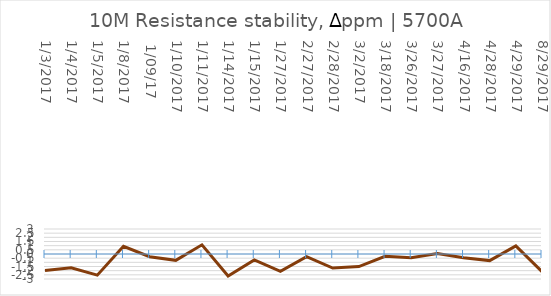
| Category | Series 0 |
|---|---|
| 1/3/2017 | -1.97 |
| 1/4/2017 | -1.65 |
| 1/5/2017 | -2.54 |
| 1/8/2017 | 0.93 |
|  1/09/17 | -0.33 |
| 1/10/2017 | -0.76 |
| 1/11/2017 | 1.1 |
| 1/14/2017 | -2.65 |
| 1/15/2017 | -0.72 |
| 1/27/2017 | -2.09 |
| 2/27/2017 | -0.32 |
| 2/28/2017 | -1.69 |
| 3/2/2017 | -1.51 |
| 3/18/2017 | -0.28 |
| 3/26/2017 | -0.45 |
| 3/27/2017 | 0.06 |
| 4/16/2017 | -0.45 |
| 4/28/2017 | -0.79 |
| 4/29/2017 | 0.97 |
| 8/29/2017 | -2.12 |